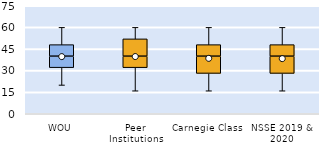
| Category | 25th | 50th | 75th |
|---|---|---|---|
| WOU | 32 | 8 | 8 |
| Peer Institutions | 32 | 8 | 12 |
| Carnegie Class | 28 | 12 | 8 |
| NSSE 2019 & 2020 | 28 | 12 | 8 |